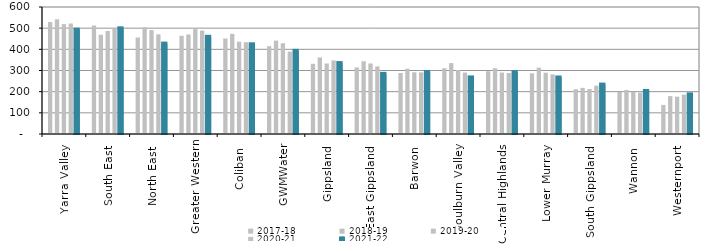
| Category | 2017-18 | 2018-19 | 2019-20 | 2020-21 | 2021-22 |
|---|---|---|---|---|---|
| Yarra Valley  | 528.88 | 541.881 | 519.241 | 521.886 | 492.914 |
| South East  | 512.63 | 469.035 | 486.81 | 496.681 | 499.16 |
| North East  | 455.98 | 504.579 | 490.631 | 471.016 | 427.133 |
| Greater Western | 463.909 | 470.184 | 495.704 | 488.497 | 459.359 |
| Coliban  | 451.08 | 473.053 | 436.124 | 433.685 | 423.818 |
| GWMWater | 414.75 | 441.313 | 428.725 | 388.804 | 392.807 |
| Gippsland  | 331.7 | 361.553 | 333.075 | 347.588 | 335.179 |
| East Gippsland  | 314.37 | 343.732 | 333.188 | 319.287 | 284.161 |
| Barwon  | 288.23 | 308.508 | 291.695 | 291 | 292.963 |
| Goulburn Valley  | 310.49 | 334.889 | 302.09 | 290.323 | 267.339 |
| Central Highlands  | 296.64 | 310.601 | 290.221 | 287.935 | 291.783 |
| Lower Murray  | 286.65 | 313.392 | 289.567 | 281.56 | 266.984 |
| South Gippsland  | 211.6 | 217.925 | 212.578 | 228.537 | 233.462 |
| Wannon  | 198.4 | 208.09 | 198.738 | 196.084 | 203.403 |
| Westernport  | 137.27 | 178.976 | 176.249 | 186.084 | 187.239 |